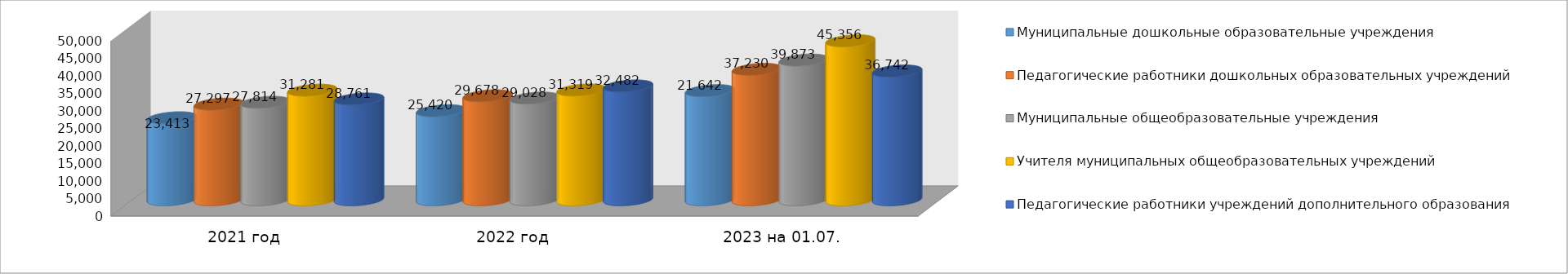
| Category | Муниципальные дошкольные образовательные учреждения | Педагогические работники дошкольных образовательных учреждений | Муниципальные общеобразовательные учреждения | Учителя муниципальных общеобразовательных учреждений | Педагогические работники учреждений дополнительного образования |
|---|---|---|---|---|---|
| 2021 год | 23413 | 27297 | 27814 | 31281 | 28761 |
| 2022 год | 25420 | 29678 | 29028 | 31319 | 32482 |
| 2023 на 01.07. | 31145 | 37230 | 39873 | 45356 | 36742 |